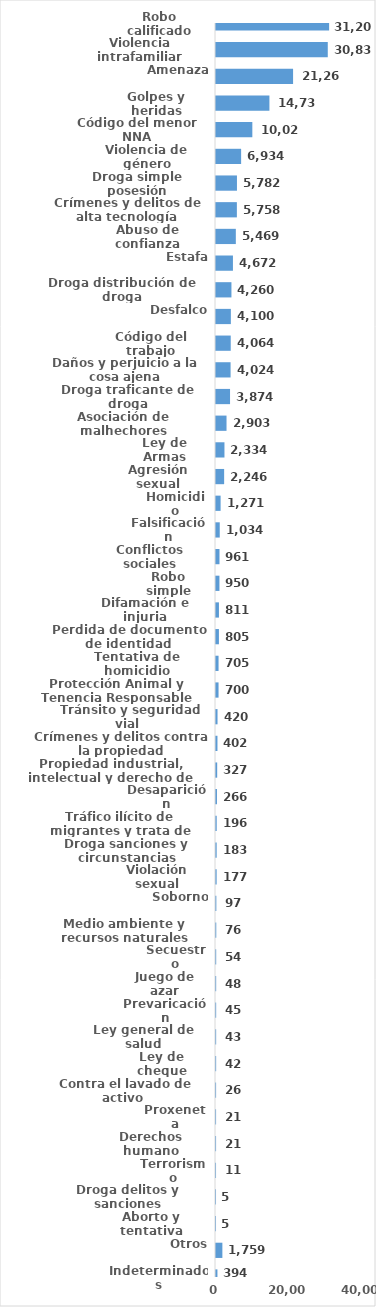
| Category | Series 0 |
|---|---|
| Robo calificado | 31209 |
| Violencia intrafamiliar | 30833 |
| Amenaza | 21265 |
| Golpes y heridas | 14735 |
| Código del menor NNA | 10023 |
| Violencia de género | 6934 |
| Droga simple posesión | 5782 |
| Crímenes y delitos de alta tecnología | 5758 |
| Abuso de confianza | 5469 |
| Estafa | 4672 |
| Droga distribución de droga | 4260 |
| Desfalco | 4100 |
| Código del trabajo | 4064 |
| Daños y perjuicio a la cosa ajena | 4024 |
| Droga traficante de droga | 3874 |
| Asociación de malhechores | 2903 |
| Ley de Armas | 2334 |
| Agresión sexual | 2246 |
| Homicidio | 1271 |
| Falsificación | 1034 |
| Conflictos sociales | 961 |
| Robo simple | 950 |
| Difamación e injuria | 811 |
| Perdida de documento de identidad | 805 |
| Tentativa de homicidio | 705 |
| Protección Animal y Tenencia Responsable | 700 |
| Tránsito y seguridad vial  | 420 |
| Crímenes y delitos contra la propiedad | 402 |
| Propiedad industrial, intelectual y derecho de autor | 327 |
| Desaparición | 266 |
| Tráfico ilícito de migrantes y trata de personas | 196 |
| Droga sanciones y circunstancias agravantes | 183 |
| Violación sexual | 177 |
| Soborno | 97 |
| Medio ambiente y recursos naturales | 76 |
| Secuestro | 54 |
| Juego de azar | 48 |
| Prevaricación | 45 |
| Ley general de salud | 43 |
| Ley de cheque | 42 |
| Contra el lavado de activo  | 26 |
| Proxeneta | 21 |
| Derechos humano | 21 |
| Terrorismo | 11 |
| Droga delitos y sanciones | 5 |
| Aborto y tentativa | 5 |
| Otros | 1759 |
| Indeterminados | 394 |